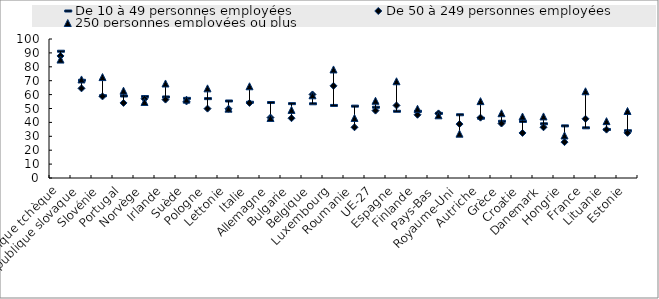
| Category | De 10 à 49 personnes employées | De 50 à 249 personnes employées | 250 personnes employées ou plus |
|---|---|---|---|
| République tchèque | 91.2 | 87.8 | 85.2 |
| République slovaque | 70.3 | 64.5 | 70.9 |
| Slovénie | 59.2 | 58.7 | 72.6 |
| Portugal | 59 | 54 | 62.8 |
| Norvège | 58.6 | 57 | 54.7 |
| Irlande | 58.3 | 56.4 | 68 |
| Suède | 57.3 | 55.1 | 56.4 |
| Pologne | 57.1 | 49.9 | 64.5 |
| Lettonie | 55.4 | 49.8 | 49.9 |
| Italie | 54.5 | 54 | 66 |
| Allemagne | 54.3 | 43.5 | 43.2 |
| Bulgarie | 53.5 | 43 | 49 |
| Belgique | 53.4 | 60.1 | 59.5 |
| Luxembourg | 52.2 | 66.3 | 78.1 |
| Roumanie | 51.7 | 36.5 | 43.2 |
| UE-27 | 50.918 | 48.479 | 55.564 |
| Espagne | 48 | 52.2 | 69.6 |
| Finlande | 48 | 45.5 | 49.8 |
| Pays-Bas | 46.5 | 46.5 | 45.1 |
| Royaume-Uni | 45.5 | 38.8 | 31.9 |
| Autriche | 43 | 43.4 | 55.3 |
| Grèce | 40.8 | 39.2 | 46.6 |
| Croatie | 40.7 | 32.4 | 44.2 |
| Danemark | 39 | 36.5 | 44.3 |
| Hongrie | 37.5 | 25.8 | 30.6 |
| France | 36.1 | 42.6 | 62.4 |
| Lituanie | 34.9 | 34.8 | 40.9 |
| Estonie | 34 | 32.5 | 48.2 |